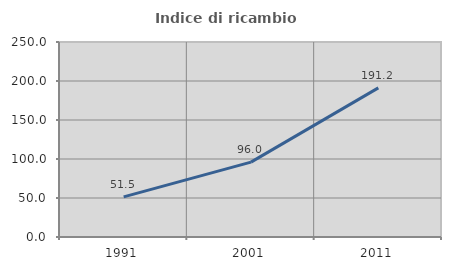
| Category | Indice di ricambio occupazionale  |
|---|---|
| 1991.0 | 51.452 |
| 2001.0 | 96.025 |
| 2011.0 | 191.237 |